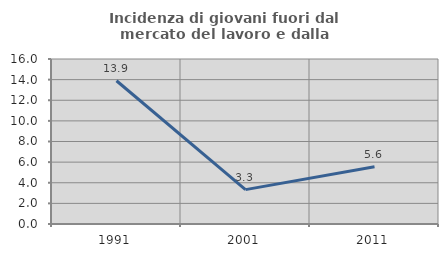
| Category | Incidenza di giovani fuori dal mercato del lavoro e dalla formazione  |
|---|---|
| 1991.0 | 13.889 |
| 2001.0 | 3.333 |
| 2011.0 | 5.556 |